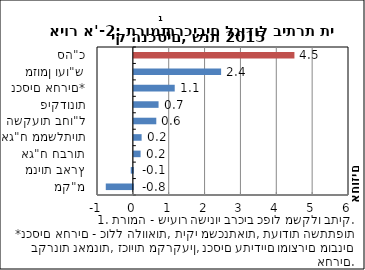
| Category | Series 0 |
|---|---|
| מק"מ | -0.755 |
| מניות בארץ | -0.059 |
| אג"ח חברות | 0.188 |
| אג"ח ממשלתיות | 0.217 |
| השקעות בחו"ל | 0.626 |
| פיקדונות | 0.689 |
| נכסים אחרים* | 1.14 |
| מזומן ועו"ש | 2.433 |
| סה"כ | 4.478 |